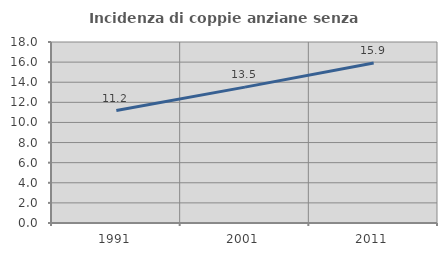
| Category | Incidenza di coppie anziane senza figli  |
|---|---|
| 1991.0 | 11.179 |
| 2001.0 | 13.511 |
| 2011.0 | 15.909 |